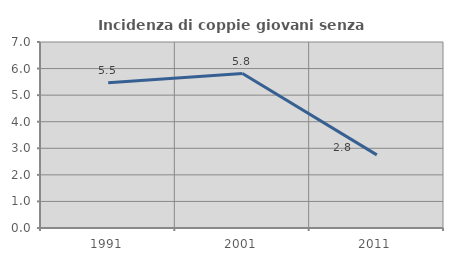
| Category | Incidenza di coppie giovani senza figli |
|---|---|
| 1991.0 | 5.469 |
| 2001.0 | 5.811 |
| 2011.0 | 2.752 |